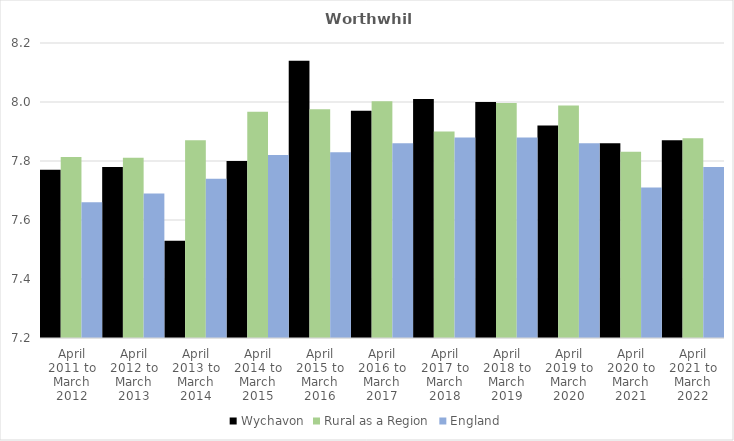
| Category | Wychavon | Rural as a Region | England |
|---|---|---|---|
| April 2011 to March 2012 | 7.77 | 7.813 | 7.66 |
| April 2012 to March 2013 | 7.78 | 7.811 | 7.69 |
| April 2013 to March 2014 | 7.53 | 7.871 | 7.74 |
| April 2014 to March 2015 | 7.8 | 7.967 | 7.82 |
| April 2015 to March 2016 | 8.14 | 7.975 | 7.83 |
| April 2016 to March 2017 | 7.97 | 8.002 | 7.86 |
| April 2017 to March 2018 | 8.01 | 7.9 | 7.88 |
| April 2018 to March 2019 | 8 | 7.996 | 7.88 |
| April 2019 to March 2020 | 7.92 | 7.988 | 7.86 |
| April 2020 to March 2021 | 7.86 | 7.831 | 7.71 |
| April 2021 to March 2022 | 7.87 | 7.877 | 7.78 |